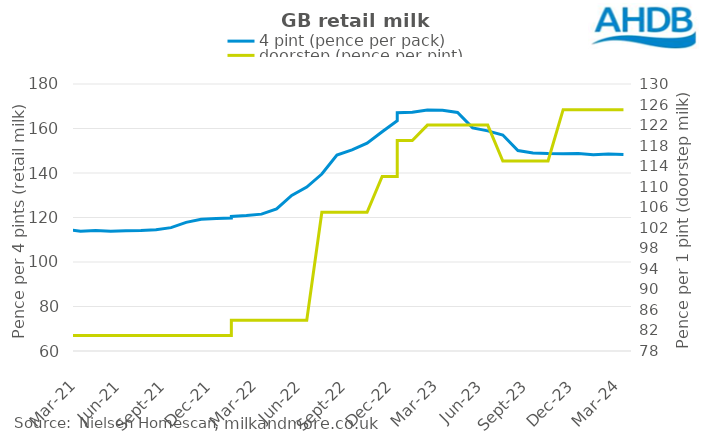
| Category | 4 pint (pence per pack) |
|---|---|
| 2020-08-15 | 114.2 |
| 2020-09-12 | 114.1 |
| 2020-10-10 | 113.75 |
| 2020-11-07 | 114.06 |
| 2020-12-05 | 114.24 |
| 2021-01-02 | 113.97 |
| 2021-01-30 | 114.7 |
| 2021-02-27 | 114.84 |
| 2021-03-27 | 113.79 |
| 2021-04-24 | 114.18 |
| 2021-05-22 | 113.83 |
| 2021-06-19 | 114.1 |
| 2021-07-17 | 114.14 |
| 2021-08-14 | 114.52 |
| 2021-09-11 | 115.44 |
| 2021-10-09 | 117.82 |
| 2021-11-06 | 119.17 |
| 2021-12-04 | 119.54 |
| 2022-01-01 | 119.79 |
| 2022-01-29 | 120.46 |
| 2022-02-26 | 120.9 |
| 2022-03-26 | 121.51 |
| 2022-04-23 | 123.89 |
| 2022-05-21 | 129.92 |
| 2022-06-18 | 133.7 |
| 2022-07-16 | 139.53 |
| 2022-08-13 | 148.05 |
| 2022-09-10 | 150.4 |
| 2022-10-08 | 153.41 |
| 2022-11-05 | 158.57 |
| 2022-12-03 | 163.54 |
| 2022-12-31 | 167.11 |
| 2023-01-28 | 167.29 |
| 2023-02-25 | 168.27 |
| 2023-03-25 | 168.2 |
| 2023-04-22 | 167.2 |
| 2023-05-20 | 160.26 |
| 2023-06-17 | 158.95 |
| 2023-07-15 | 157.05 |
| 2023-08-12 | 150.08 |
| 2023-09-09 | 148.96 |
| 2023-10-07 | 148.72 |
| 2023-11-04 | 148.63 |
| 2023-12-02 | 148.72 |
| 2023-12-30 | 148.54 |
| 2024-01-27 | 148.19 |
| 2024-02-24 | 148.51 |
| 2024-03-23 | 148.29 |